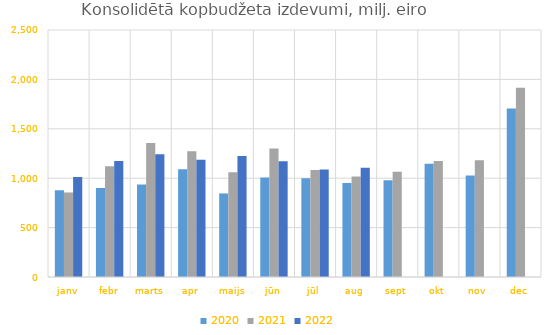
| Category | 2020 | 2021 | 2022 |
|---|---|---|---|
| janv | 878360.095 | 855571.821 | 1011780.956 |
| febr | 900276.14 | 1120070.85 | 1174583.857 |
| marts | 935266.915 | 1355758.12 | 1242068.533 |
| apr | 1090965.926 | 1273663.147 | 1187341.457 |
| maijs | 845625.072 | 1060453.286 | 1224137.323 |
| jūn | 1007637.852 | 1299852.065 | 1172050.575 |
| jūl | 999723.1 | 1081981.296 | 1088648.602 |
| aug | 951921.221 | 1017502.093 | 1104689.423 |
| sept | 978775.82 | 1064391.019 | 0 |
| okt | 1146014.897 | 1173896.626 | 0 |
| nov | 1028398.84 | 1182055.554 | 0 |
| dec | 1706433.895 | 1915376.849 | 0 |